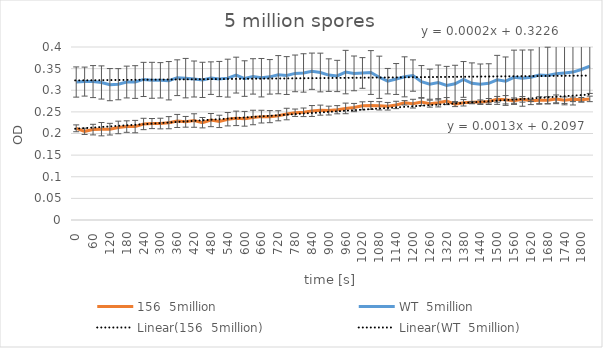
| Category | 156  5million | WT  5million |
|---|---|---|
| 0.0 | 0.212 | 0.319 |
| 30.0 | 0.205 | 0.32 |
| 60.0 | 0.209 | 0.32 |
| 90.0 | 0.21 | 0.318 |
| 120.0 | 0.21 | 0.313 |
| 150.0 | 0.214 | 0.314 |
| 180.0 | 0.216 | 0.319 |
| 210.0 | 0.216 | 0.319 |
| 240.0 | 0.222 | 0.325 |
| 270.0 | 0.223 | 0.323 |
| 300.0 | 0.223 | 0.323 |
| 330.0 | 0.225 | 0.322 |
| 360.0 | 0.229 | 0.329 |
| 390.0 | 0.227 | 0.328 |
| 420.0 | 0.23 | 0.326 |
| 450.0 | 0.225 | 0.324 |
| 480.0 | 0.231 | 0.328 |
| 510.0 | 0.228 | 0.326 |
| 540.0 | 0.233 | 0.328 |
| 570.0 | 0.235 | 0.335 |
| 600.0 | 0.234 | 0.327 |
| 630.0 | 0.237 | 0.332 |
| 660.0 | 0.239 | 0.329 |
| 690.0 | 0.239 | 0.331 |
| 720.0 | 0.241 | 0.336 |
| 750.0 | 0.245 | 0.334 |
| 780.0 | 0.248 | 0.339 |
| 810.0 | 0.249 | 0.34 |
| 840.0 | 0.252 | 0.344 |
| 870.0 | 0.254 | 0.341 |
| 900.0 | 0.253 | 0.335 |
| 930.0 | 0.255 | 0.333 |
| 960.0 | 0.258 | 0.342 |
| 990.0 | 0.26 | 0.339 |
| 1020.0 | 0.264 | 0.34 |
| 1050.0 | 0.265 | 0.341 |
| 1080.0 | 0.264 | 0.33 |
| 1110.0 | 0.263 | 0.321 |
| 1140.0 | 0.266 | 0.326 |
| 1170.0 | 0.271 | 0.331 |
| 1200.0 | 0.269 | 0.334 |
| 1230.0 | 0.273 | 0.32 |
| 1260.0 | 0.269 | 0.314 |
| 1290.0 | 0.271 | 0.318 |
| 1320.0 | 0.275 | 0.311 |
| 1350.0 | 0.268 | 0.315 |
| 1380.0 | 0.271 | 0.325 |
| 1410.0 | 0.272 | 0.316 |
| 1440.0 | 0.273 | 0.314 |
| 1470.0 | 0.274 | 0.316 |
| 1500.0 | 0.279 | 0.324 |
| 1530.0 | 0.278 | 0.321 |
| 1560.0 | 0.276 | 0.33 |
| 1590.0 | 0.279 | 0.328 |
| 1620.0 | 0.276 | 0.33 |
| 1650.0 | 0.277 | 0.335 |
| 1680.0 | 0.277 | 0.334 |
| 1710.0 | 0.28 | 0.338 |
| 1740.0 | 0.277 | 0.34 |
| 1770.0 | 0.279 | 0.342 |
| 1800.0 | 0.278 | 0.348 |
| 1830.0 | 0.28 | 0.356 |